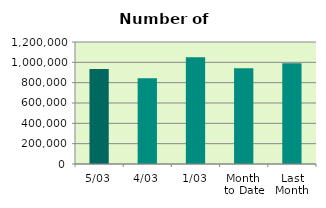
| Category | Series 0 |
|---|---|
| 5/03 | 933398 |
| 4/03 | 843454 |
| 1/03 | 1049706 |
| Month 
to Date | 942186 |
| Last
Month | 989849.1 |